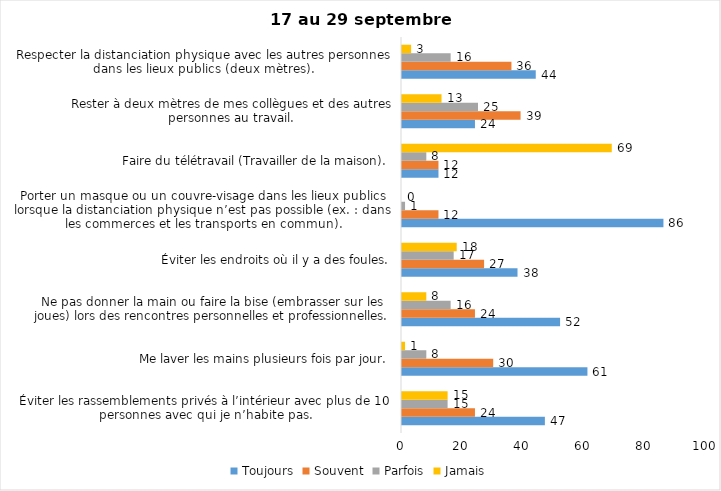
| Category | Toujours | Souvent | Parfois | Jamais |
|---|---|---|---|---|
| Éviter les rassemblements privés à l’intérieur avec plus de 10 personnes avec qui je n’habite pas. | 47 | 24 | 15 | 15 |
| Me laver les mains plusieurs fois par jour. | 61 | 30 | 8 | 1 |
| Ne pas donner la main ou faire la bise (embrasser sur les joues) lors des rencontres personnelles et professionnelles. | 52 | 24 | 16 | 8 |
| Éviter les endroits où il y a des foules. | 38 | 27 | 17 | 18 |
| Porter un masque ou un couvre-visage dans les lieux publics lorsque la distanciation physique n’est pas possible (ex. : dans les commerces et les transports en commun). | 86 | 12 | 1 | 0 |
| Faire du télétravail (Travailler de la maison). | 12 | 12 | 8 | 69 |
| Rester à deux mètres de mes collègues et des autres personnes au travail. | 24 | 39 | 25 | 13 |
| Respecter la distanciation physique avec les autres personnes dans les lieux publics (deux mètres). | 44 | 36 | 16 | 3 |